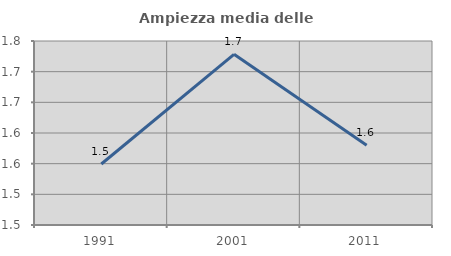
| Category | Ampiezza media delle famiglie |
|---|---|
| 1991.0 | 1.549 |
| 2001.0 | 1.728 |
| 2011.0 | 1.58 |